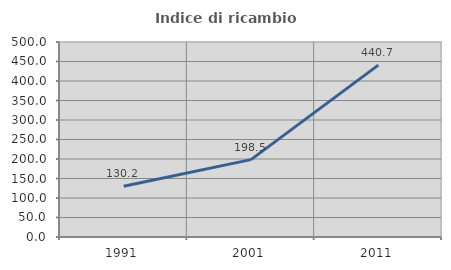
| Category | Indice di ricambio occupazionale  |
|---|---|
| 1991.0 | 130.243 |
| 2001.0 | 198.467 |
| 2011.0 | 440.736 |